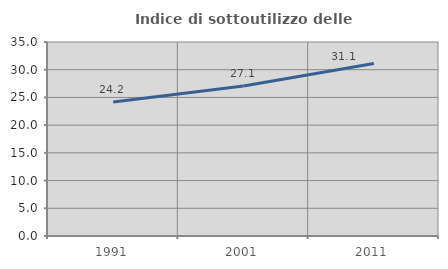
| Category | Indice di sottoutilizzo delle abitazioni  |
|---|---|
| 1991.0 | 24.188 |
| 2001.0 | 27.052 |
| 2011.0 | 31.127 |